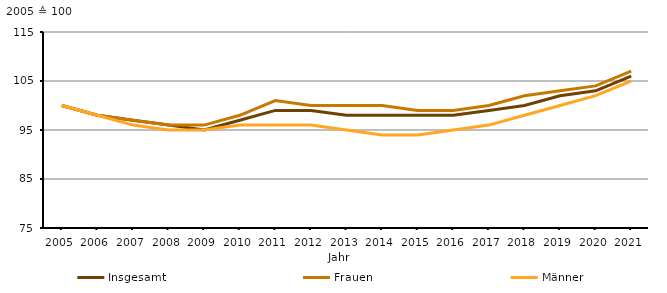
| Category | Insgesamt | Frauen | Männer |
|---|---|---|---|
| 2005.0 | 100 | 100 | 100 |
| 2006.0 | 98 | 98 | 98 |
| 2007.0 | 97 | 97 | 96 |
| 2008.0 | 96 | 96 | 95 |
| 2009.0 | 95 | 96 | 95 |
| 2010.0 | 97 | 98 | 96 |
| 2011.0 | 99 | 101 | 96 |
| 2012.0 | 99 | 100 | 96 |
| 2013.0 | 98 | 100 | 95 |
| 2014.0 | 98 | 100 | 94 |
| 2015.0 | 98 | 99 | 94 |
| 2016.0 | 98 | 99 | 95 |
| 2017.0 | 99 | 100 | 96 |
| 2018.0 | 100 | 102 | 98 |
| 2019.0 | 102 | 103 | 100 |
| 2020.0 | 103 | 104 | 102 |
| 2021.0 | 106 | 107 | 105 |